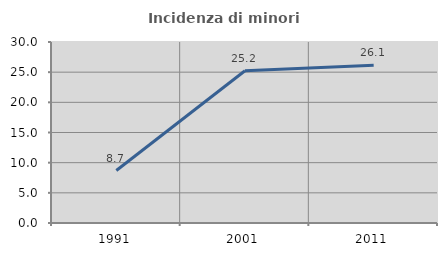
| Category | Incidenza di minori stranieri |
|---|---|
| 1991.0 | 8.696 |
| 2001.0 | 25.225 |
| 2011.0 | 26.14 |